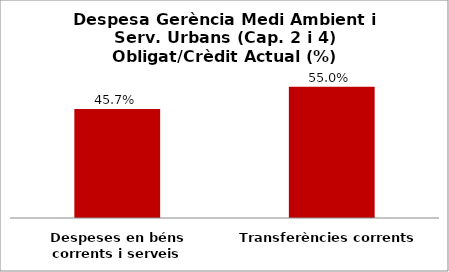
| Category | Series 0 |
|---|---|
| Despeses en béns corrents i serveis | 0.457 |
| Transferències corrents | 0.55 |